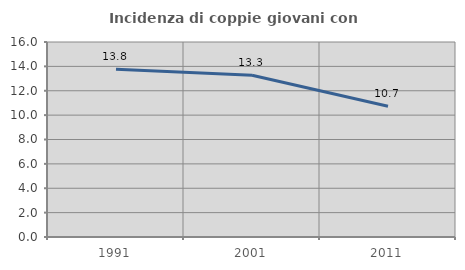
| Category | Incidenza di coppie giovani con figli |
|---|---|
| 1991.0 | 13.772 |
| 2001.0 | 13.265 |
| 2011.0 | 10.73 |